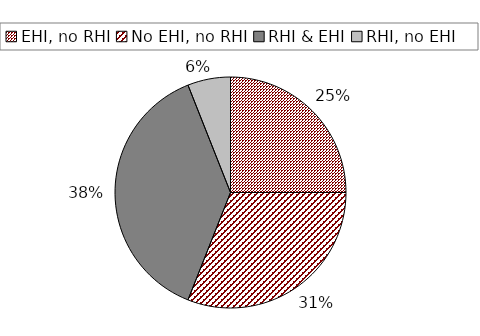
| Category | Series 0 |
|---|---|
| EHI, no RHI | 0.25 |
| No EHI, no RHI | 0.31 |
| RHI & EHI | 0.38 |
| RHI, no EHI | 0.06 |